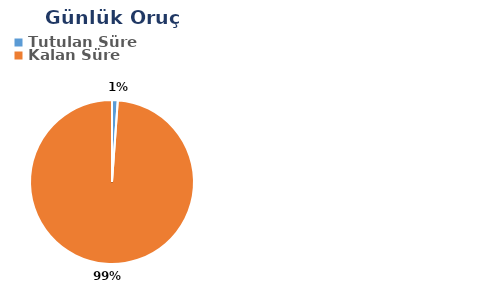
| Category | Günlük |
|---|---|
| Tutulan Süre | 0.006 |
| Kalan Süre | 0.567 |